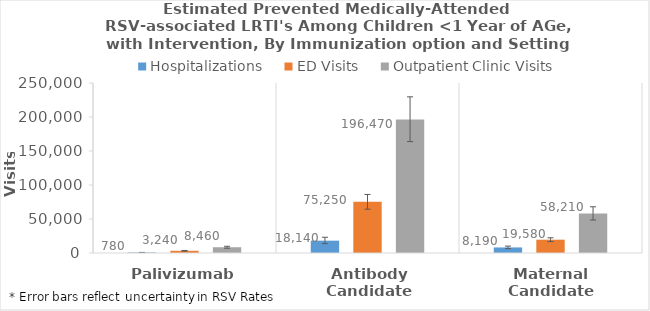
| Category | Hospitalizations | ED Visits | Outpatient Clinic Visits |
|---|---|---|---|
| Palivizumab | 780 | 3240 | 8460 |
| Antibody Candidate | 18140 | 75250 | 196470 |
| Maternal Candidate | 8190 | 19580 | 58210 |